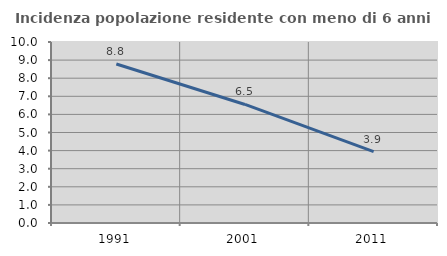
| Category | Incidenza popolazione residente con meno di 6 anni |
|---|---|
| 1991.0 | 8.786 |
| 2001.0 | 6.549 |
| 2011.0 | 3.948 |